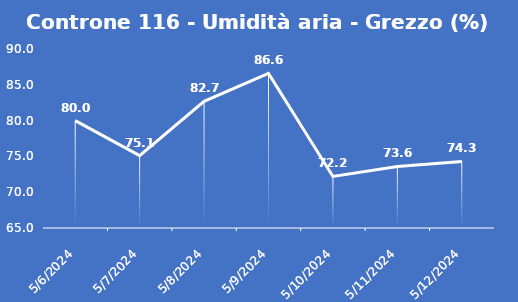
| Category | Controne 116 - Umidità aria - Grezzo (%) |
|---|---|
| 5/6/24 | 80 |
| 5/7/24 | 75.1 |
| 5/8/24 | 82.7 |
| 5/9/24 | 86.6 |
| 5/10/24 | 72.2 |
| 5/11/24 | 73.6 |
| 5/12/24 | 74.3 |